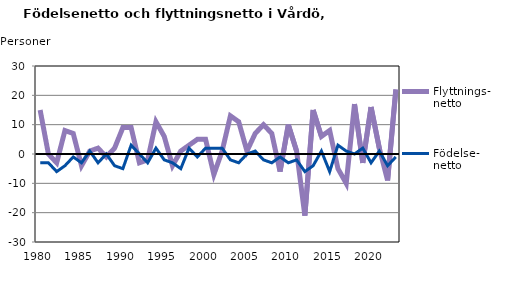
| Category | Flyttnings- netto | Födelse- netto |
|---|---|---|
| 1980.0 | 15 | -3 |
| 1981.0 | 0 | -3 |
| 1982.0 | -3 | -6 |
| 1983.0 | 8 | -4 |
| 1984.0 | 7 | -1 |
| 1985.0 | -4 | -3 |
| 1986.0 | 1 | 1 |
| 1987.0 | 2 | -3 |
| 1988.0 | -1 | 0 |
| 1989.0 | 2 | -4 |
| 1990.0 | 9 | -5 |
| 1991.0 | 9 | 3 |
| 1992.0 | -3 | 0 |
| 1993.0 | -2 | -3 |
| 1994.0 | 11 | 2 |
| 1995.0 | 6 | -2 |
| 1996.0 | -4 | -3 |
| 1997.0 | 1 | -5 |
| 1998.0 | 3 | 2 |
| 1999.0 | 5 | -1 |
| 2000.0 | 5 | 2 |
| 2001.0 | -7 | 2 |
| 2002.0 | 1 | 2 |
| 2003.0 | 13 | -2 |
| 2004.0 | 11 | -3 |
| 2005.0 | 1 | 0 |
| 2006.0 | 7 | 1 |
| 2007.0 | 10 | -2 |
| 2008.0 | 7 | -3 |
| 2009.0 | -6 | -1 |
| 2010.0 | 10 | -3 |
| 2011.0 | 1 | -2 |
| 2012.0 | -21 | -6 |
| 2013.0 | 15 | -4 |
| 2014.0 | 6 | 1 |
| 2015.0 | 8 | -6 |
| 2016.0 | -5 | 3 |
| 2017.0 | -10 | 1 |
| 2018.0 | 17 | 0 |
| 2019.0 | -3 | 2 |
| 2020.0 | 16 | -3 |
| 2021.0 | 2 | 1 |
| 2022.0 | -9 | -4 |
| 2023.0 | 22 | -1 |